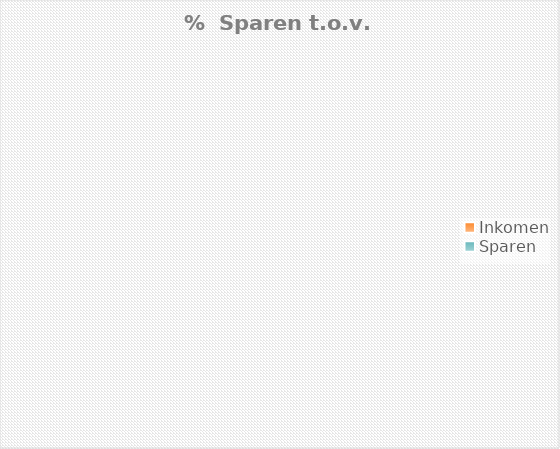
| Category | Series 0 |
|---|---|
| Inkomen | 0 |
| Sparen | 0 |